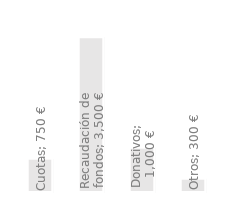
| Category | Ingresos anuales |
|---|---|
| Cuotas | 750 |
| Recaudación de fondos | 3500 |
| Donativos | 1000 |
| Otros | 300 |